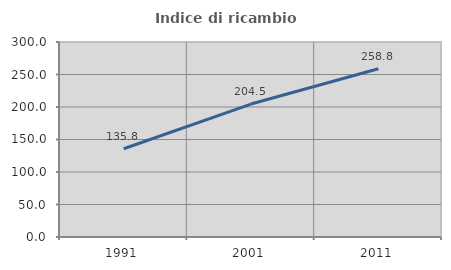
| Category | Indice di ricambio occupazionale  |
|---|---|
| 1991.0 | 135.821 |
| 2001.0 | 204.52 |
| 2011.0 | 258.763 |